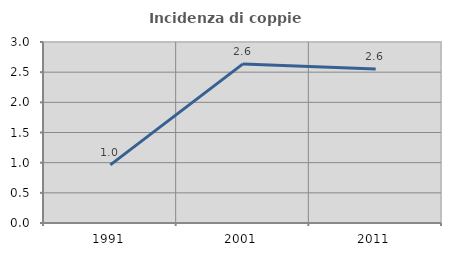
| Category | Incidenza di coppie miste |
|---|---|
| 1991.0 | 0.964 |
| 2001.0 | 2.637 |
| 2011.0 | 2.55 |